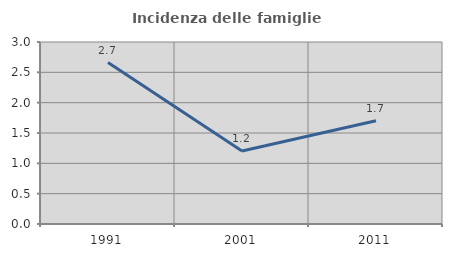
| Category | Incidenza delle famiglie numerose |
|---|---|
| 1991.0 | 2.662 |
| 2001.0 | 1.203 |
| 2011.0 | 1.702 |